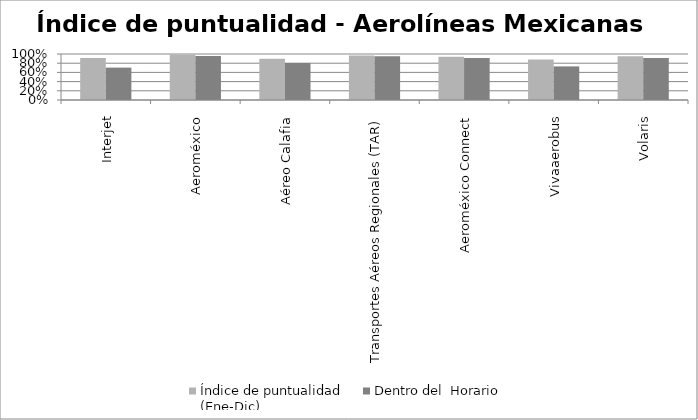
| Category | Índice de puntualidad
(Ene-Dic) | Dentro del  Horario |
|---|---|---|
| Interjet | 0.914 | 0.704 |
| Aeroméxico | 0.988 | 0.954 |
| Aéreo Calafia | 0.898 | 0.807 |
| Transportes Aéreos Regionales (TAR) | 0.968 | 0.952 |
| Aeroméxico Connect | 0.94 | 0.912 |
| Vivaaerobus | 0.879 | 0.73 |
| Volaris | 0.953 | 0.914 |